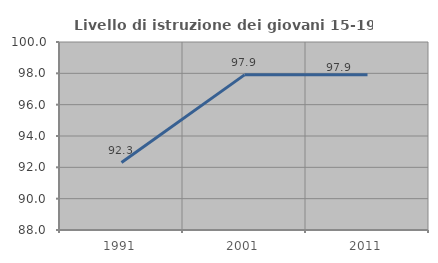
| Category | Livello di istruzione dei giovani 15-19 anni |
|---|---|
| 1991.0 | 92.308 |
| 2001.0 | 97.902 |
| 2011.0 | 97.902 |